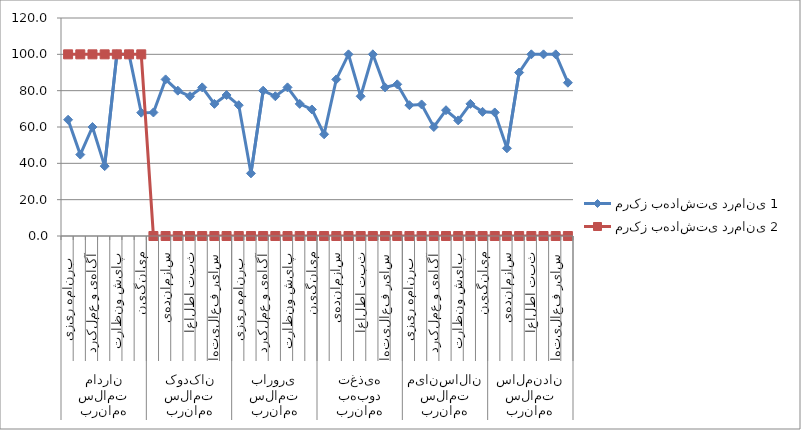
| Category | مرکز بهداشتی درمانی 1 | مرکز بهداشتی درمانی 2 |
|---|---|---|
| 0 | 64 | 100 |
| 1 | 44.828 | 100 |
| 2 | 60 | 100 |
| 3 | 38.462 | 100 |
| 4 | 100 | 100 |
| 5 | 100 | 100 |
| 6 | 67.882 | 100 |
| 7 | 68 | 0 |
| 8 | 86.207 | 0 |
| 9 | 80 | 0 |
| 10 | 76.923 | 0 |
| 11 | 81.818 | 0 |
| 12 | 72.727 | 0 |
| 13 | 77.613 | 0 |
| 14 | 72 | 0 |
| 15 | 34.483 | 0 |
| 16 | 80 | 0 |
| 17 | 76.923 | 0 |
| 18 | 81.818 | 0 |
| 19 | 72.727 | 0 |
| 20 | 69.659 | 0 |
| 21 | 56 | 0 |
| 22 | 86.207 | 0 |
| 23 | 100 | 0 |
| 24 | 76.923 | 0 |
| 25 | 100 | 0 |
| 26 | 81.818 | 0 |
| 27 | 83.491 | 0 |
| 28 | 72 | 0 |
| 29 | 72.414 | 0 |
| 30 | 60 | 0 |
| 31 | 69.231 | 0 |
| 32 | 63.636 | 0 |
| 33 | 72.727 | 0 |
| 34 | 68.335 | 0 |
| 35 | 68 | 0 |
| 36 | 48.276 | 0 |
| 37 | 90 | 0 |
| 38 | 100 | 0 |
| 39 | 100 | 0 |
| 40 | 100 | 0 |
| 41 | 84.379 | 0 |